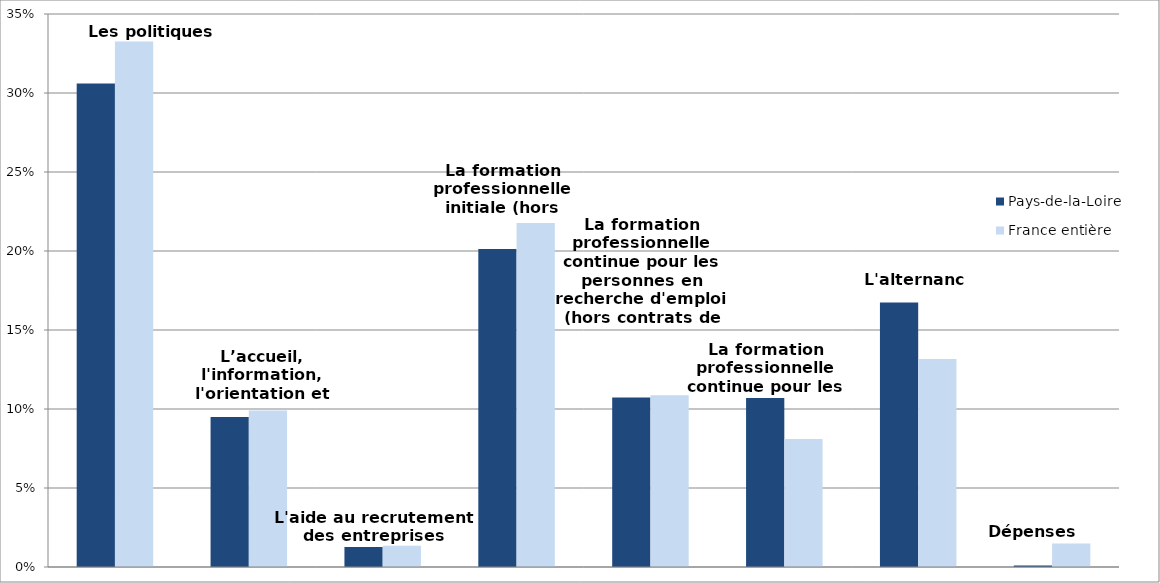
| Category | Pays-de-la-Loire | France entière |
|---|---|---|
| Les politiques d'emploi | 0.306 | 0.333 |
| L’accueil, l'information, l'orientation et l'accompagnement | 0.095 | 0.099 |
| L'aide au recrutement des entreprises | 0.013 | 0.013 |
| La formation professionnelle initiale (hors apprentissage) | 0.201 | 0.218 |
| La formation professionnelle continue pour les personnes en recherche d'emploi (hors contrats de professionnalisation) | 0.107 | 0.109 |
| La formation professionnelle continue pour les actifs occupés | 0.107 | 0.081 |
| L'alternance | 0.167 | 0.132 |
| Dépenses non-ventilables | 0.001 | 0.015 |